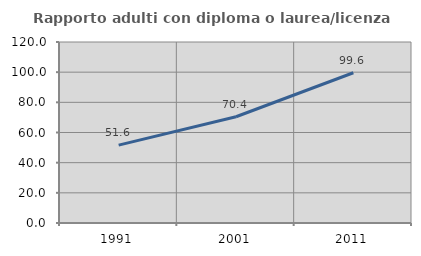
| Category | Rapporto adulti con diploma o laurea/licenza media  |
|---|---|
| 1991.0 | 51.614 |
| 2001.0 | 70.44 |
| 2011.0 | 99.615 |